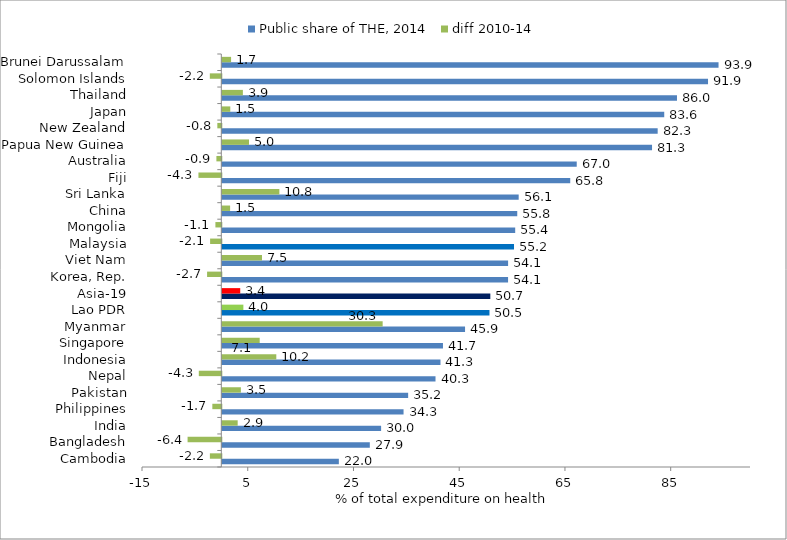
| Category | Public share of THE, 2014 | diff 2010-14 |
|---|---|---|
| Cambodia | 22.042 | -2.161 |
| Bangladesh | 27.901 | -6.378 |
| India | 30.037 | 2.908 |
| Philippines | 34.282 | -1.696 |
| Pakistan | 35.151 | 3.513 |
| Nepal | 40.327 | -4.257 |
| Indonesia | 41.266 | 10.215 |
| Singapore | 41.738 | 7.073 |
| Myanmar | 45.914 | 30.331 |
| Lao PDR | 50.534 | 3.984 |
| Asia-19 | 50.693 | 3.392 |
| Korea, Rep. | 54.051 | -2.69 |
| Viet Nam | 54.056 | 7.506 |
| Malaysia | 55.175 | -2.119 |
| Mongolia | 55.399 | -1.116 |
| China | 55.787 | 1.476 |
| Sri Lanka | 56.059 | 10.793 |
| Fiji | 65.81 | -4.325 |
| Australia | 67.039 | -0.927 |
| Papua New Guinea | 81.283 | 5.047 |
| New Zealand | 82.348 | -0.752 |
| Japan | 83.589 | 1.509 |
| Thailand | 86.001 | 3.891 |
| Solomon Islands | 91.871 | -2.17 |
| Brunei Darussalam | 93.86 | 1.66 |